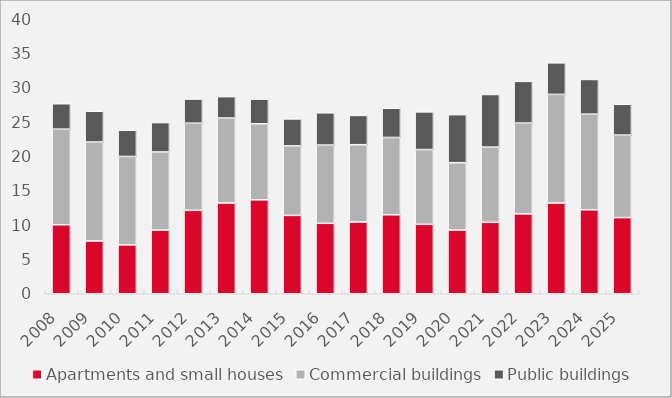
| Category | Apartments and small houses | Commercial buildings | Public buildings |
|---|---|---|---|
| 2008.0 | 10.038 | 13.904 | 3.698 |
| 2009.0 | 7.682 | 14.389 | 4.47 |
| 2010.0 | 7.115 | 12.856 | 3.819 |
| 2011.0 | 9.259 | 11.367 | 4.27 |
| 2012.0 | 12.136 | 12.674 | 3.514 |
| 2013.0 | 13.199 | 12.36 | 3.114 |
| 2014.0 | 13.666 | 11.051 | 3.598 |
| 2015.0 | 11.399 | 10.106 | 3.924 |
| 2016.0 | 10.248 | 11.377 | 4.696 |
| 2017.0 | 10.43 | 11.249 | 4.262 |
| 2018.0 | 11.489 | 11.244 | 4.246 |
| 2019.0 | 10.097 | 10.88 | 5.476 |
| 2020.0 | 9.251 | 9.811 | 6.989 |
| 2021.0 | 10.387 | 10.943 | 7.652 |
| 2022.0 | 11.619 | 13.204 | 6.072 |
| 2023.0 | 13.196 | 15.803 | 4.59 |
| 2024.0 | 12.219 | 13.905 | 5.045 |
| 2025.0 | 11.081 | 11.997 | 4.483 |